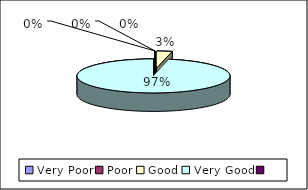
| Category | How would you rate the attitude of staff |
|---|---|
| Very Poor | 0 |
| Poor | 0 |
| Good | 2 |
| Very Good | 59 |